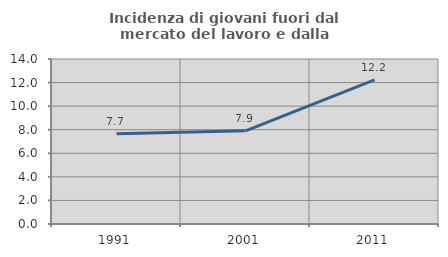
| Category | Incidenza di giovani fuori dal mercato del lavoro e dalla formazione  |
|---|---|
| 1991.0 | 7.662 |
| 2001.0 | 7.91 |
| 2011.0 | 12.22 |